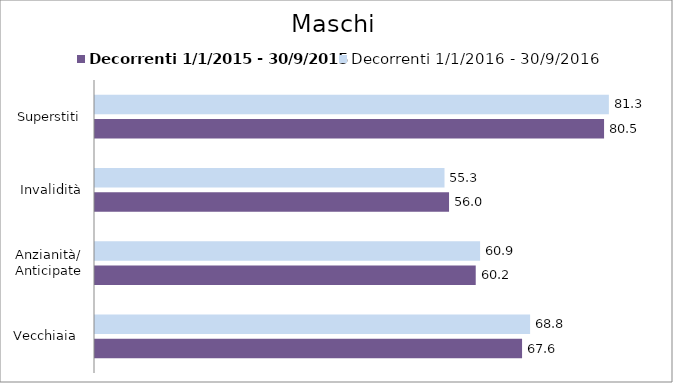
| Category | Decorrenti 1/1/2015 - 30/9/2015 | Decorrenti 1/1/2016 - 30/9/2016 |
|---|---|---|
| Vecchiaia  | 67.55 | 68.82 |
| Anzianità/ Anticipate | 60.22 | 60.91 |
| Invalidità | 56 | 55.28 |
| Superstiti | 80.52 | 81.28 |